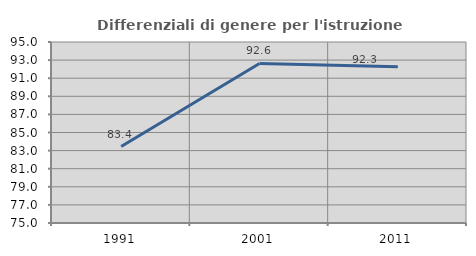
| Category | Differenziali di genere per l'istruzione superiore |
|---|---|
| 1991.0 | 83.449 |
| 2001.0 | 92.633 |
| 2011.0 | 92.264 |